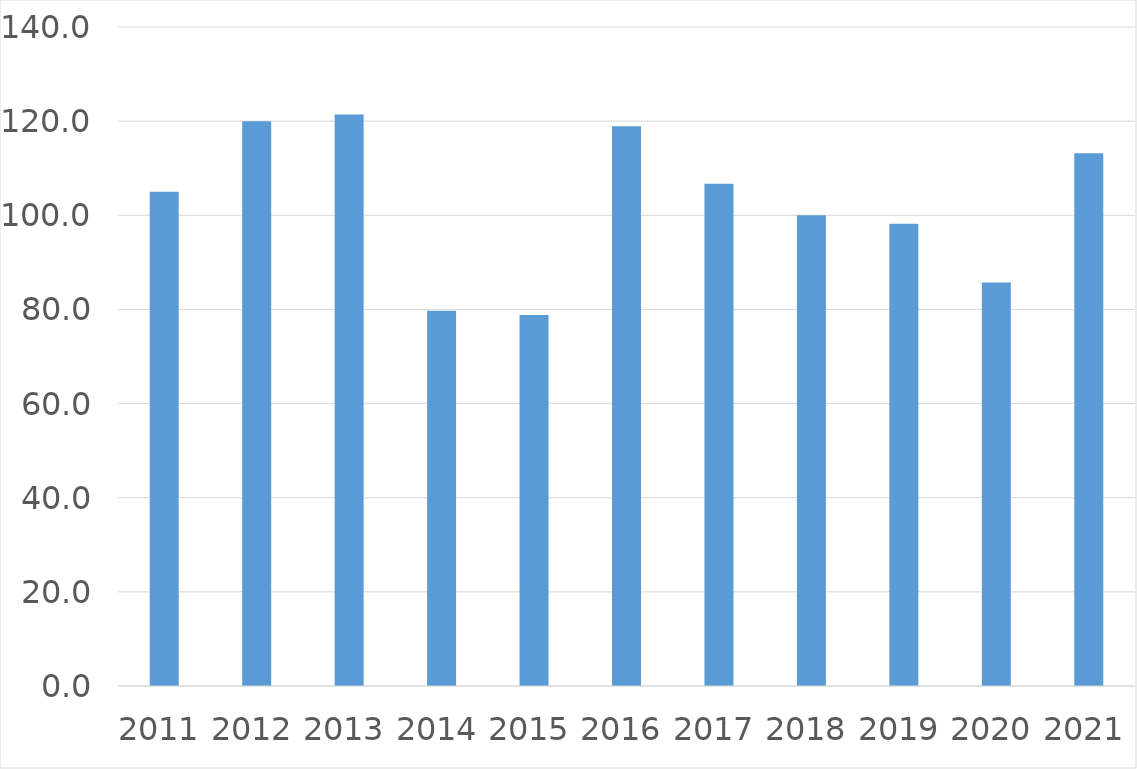
| Category | Series 0 |
|---|---|
| 2011 | 105 |
| 2012 | 120 |
| 2013 | 121.4 |
| 2014 | 79.7 |
| 2015 | 78.8 |
| 2016 | 118.9 |
| 2017 | 106.7 |
| 2018 | 100 |
| 2019 | 98.2 |
| 2020 | 85.7 |
| 2021 | 113.2 |